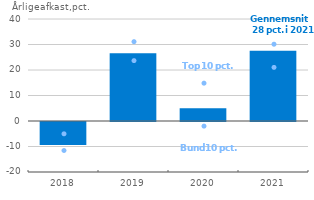
| Category | Gennemsnitligt afkast |
|---|---|
| 2018.0 | -9.01 |
| 2019.0 | 26.54 |
| 2020.0 | 5.01 |
| 2021.0 | 27.54 |